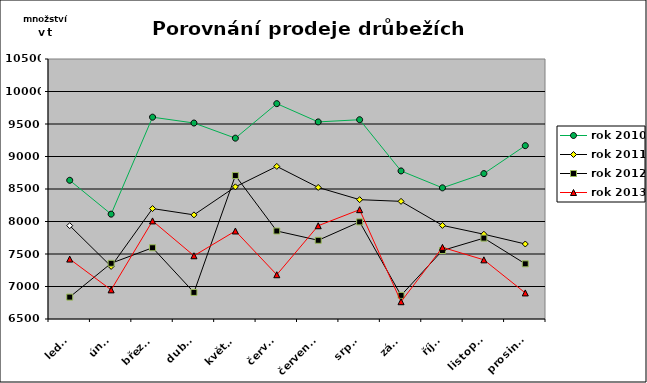
| Category | rok 2010 | rok 2011 | rok 2012 | rok 2013 |
|---|---|---|---|---|
| leden | 8634 | 7936 | 6837 | 7422 |
| únor | 8113 | 7309 | 7357 | 6948 |
| březen | 9605 | 8199 | 7596 | 8009 |
| duben | 9515 | 8102 | 6909 | 7473 |
| květen | 9282 | 8533 | 8707 | 7854 |
| červen | 9813 | 8848 | 7854 | 7181 |
| červenec | 9532 | 8524 | 7711 | 7935 |
| srpen | 9566 | 8336 | 7994 | 8182 |
| září | 8778 | 8310 | 6863 | 6766 |
| říjen | 8518 | 7940 | 7554 | 7602 |
| listopad | 8737 | 7804 | 7744 | 7410 |
| prosinec | 9167 | 7654 | 7349 | 6901 |